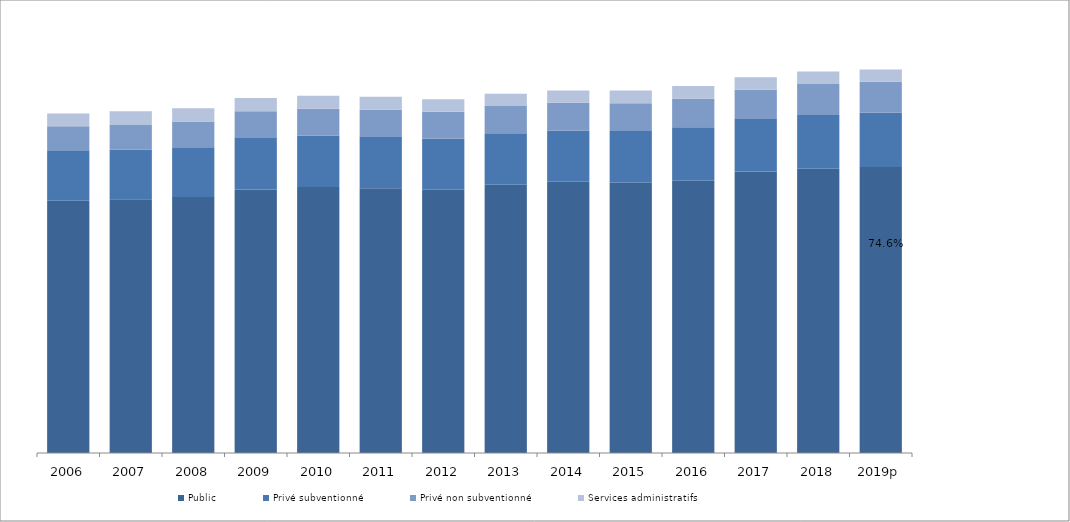
| Category | Public | Privé subventionné | Privé non subventionné | Services administratifs  |
|---|---|---|---|---|
| 2006 | 101.383 | 20.212 | 9.64 | 5.187 |
| 2007 | 101.967 | 19.996 | 9.864 | 5.472 |
| 2008 | 102.831 | 19.993 | 10.398 | 5.335 |
| 2009 | 105.839 | 20.69 | 10.817 | 5.318 |
| 2010 | 106.909 | 20.684 | 10.702 | 5.267 |
| 2011 | 106.391 | 20.598 | 10.902 | 5.217 |
| 2012 | 105.82 | 20.452 | 10.842 | 4.975 |
| 2013 | 107.743 | 20.718 | 11.003 | 4.882 |
| 2014 | 108.971 | 20.56 | 11.163 | 4.99 |
| 2015 | 108.622 | 20.792 | 11.068 | 5.192 |
| 2016 | 109.371 | 21.478 | 11.466 | 5.114 |
| 2017 | 113.127 | 21.103 | 11.704 | 5.037 |
| 2018 | 114.206 | 21.628 | 12.399 | 5.02 |
| 2019p | 114.942 | 21.742 | 12.472 | 4.919 |